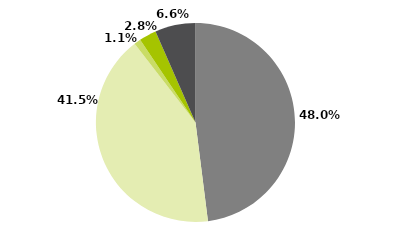
| Category | Series 0 |
|---|---|
| Multimercados Macro | 0.48 |
| Multimercados Livre | 0.415 |
| Multimercados L/S - Neutro | 0.011 |
| Multimercados L/S - Direcional | 0.028 |
| Outros | 0.066 |